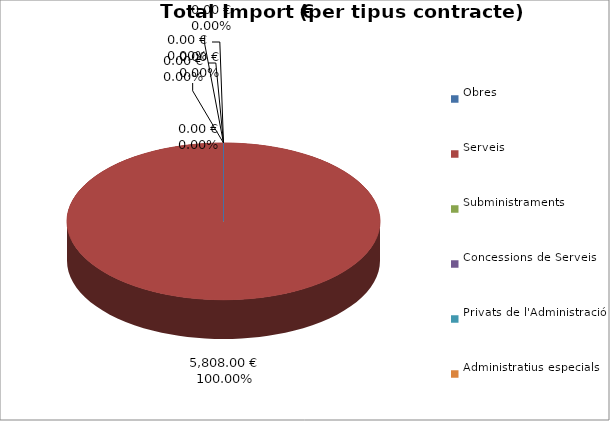
| Category | Total preu
(amb IVA) |
|---|---|
| Obres | 0 |
| Serveis | 5808 |
| Subministraments | 0 |
| Concessions de Serveis | 0 |
| Privats de l'Administració | 0 |
| Administratius especials | 0 |